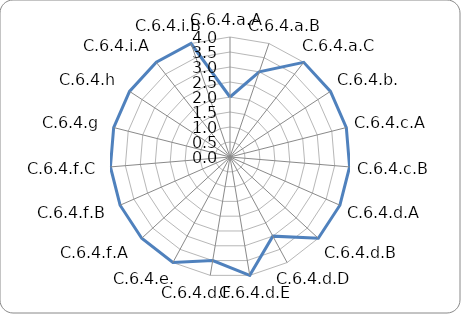
| Category | Series 0 |
|---|---|
| C.6.4.a.A | 2 |
| C.6.4.a.B | 3 |
| C.6.4.a.C | 4 |
| C.6.4.b. | 4 |
| C.6.4.c.A | 4 |
| C.6.4.c.B | 4 |
| C.6.4.d.A | 4 |
| C.6.4.d.B | 4 |
| C.6.4.d.D | 3 |
| C.6.4.d.E | 4 |
| C.6.4.d.F | 3.5 |
| C.6.4.e. | 4 |
| C.6.4.f.A | 4 |
| C.6.4.f.B | 4 |
| C.6.4.f.C | 4 |
| C.6.4.g | 4 |
| C.6.4.h | 4 |
| C.6.4.i.A | 4 |
| C.6.4.i.B | 4 |